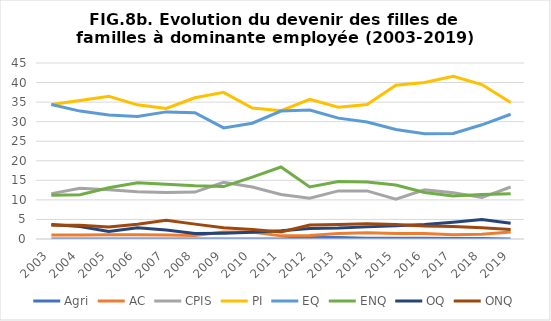
| Category | Agri | AC | CPIS | PI | EQ | ENQ | OQ | ONQ |
|---|---|---|---|---|---|---|---|---|
| 2003.0 | 0 | 1 | 11.6 | 34.4 | 34.4 | 11.2 | 3.7 | 3.5 |
| 2004.0 | 0 | 1 | 13 | 35.4 | 32.7 | 11.3 | 3.2 | 3.5 |
| 2005.0 | 0 | 1.1 | 12.6 | 36.5 | 31.7 | 13.1 | 1.9 | 3.1 |
| 2006.0 | 0 | 1.1 | 12.1 | 34.3 | 31.3 | 14.4 | 2.9 | 3.8 |
| 2007.0 | 0 | 1 | 11.9 | 33.4 | 32.5 | 14 | 2.3 | 4.8 |
| 2008.0 | 0 | 0.9 | 12 | 36.1 | 32.3 | 13.6 | 1.4 | 3.8 |
| 2009.0 | 0 | 1.8 | 14.5 | 37.5 | 28.4 | 13.4 | 1.5 | 2.9 |
| 2010.0 | 0 | 1.8 | 13.3 | 33.5 | 29.6 | 15.8 | 1.7 | 2.4 |
| 2011.0 | 0 | 0.8 | 11.4 | 32.8 | 32.7 | 18.4 | 2.1 | 1.8 |
| 2012.0 | 0.4 | 0.9 | 10.4 | 35.7 | 33 | 13.3 | 2.7 | 3.6 |
| 2013.0 | 0.4 | 1.4 | 12.3 | 33.7 | 30.9 | 14.7 | 2.8 | 3.7 |
| 2014.0 | 0.2 | 1.6 | 12.3 | 34.4 | 29.9 | 14.6 | 3.1 | 3.9 |
| 2015.0 | 0.2 | 1.4 | 10.2 | 39.3 | 28 | 13.8 | 3.4 | 3.7 |
| 2016.0 | 0.2 | 1.4 | 12.6 | 40 | 26.9 | 11.9 | 3.7 | 3.3 |
| 2017.0 | 0.1 | 1.1 | 11.8 | 41.6 | 27 | 11 | 4.3 | 3.2 |
| 2018.0 | 0.1 | 1.2 | 10.6 | 39.5 | 29.2 | 11.4 | 5 | 2.9 |
| 2019.0 | 0 | 1.8 | 13.3 | 34.9 | 31.9 | 11.6 | 4 | 2.4 |